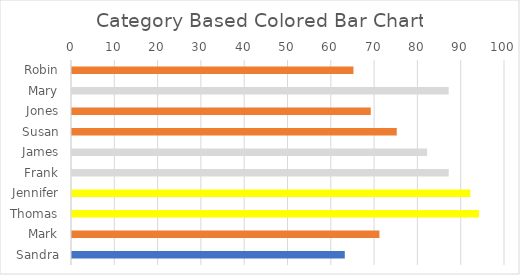
| Category | Score |
|---|---|
| Robin | 65 |
| Mary | 87 |
| Jones | 69 |
| Susan | 75 |
| James | 82 |
| Frank | 87 |
| Jennifer | 92 |
| Thomas | 94 |
| Mark | 71 |
| Sandra | 63 |